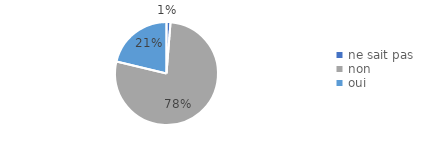
| Category | % |
|---|---|
| ne sait pas | 0.012 |
| non | 0.775 |
| oui | 0.212 |